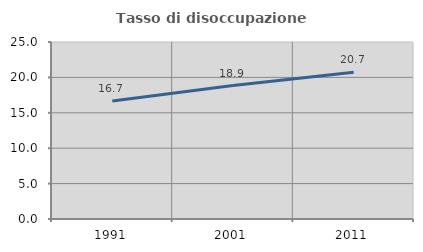
| Category | Tasso di disoccupazione giovanile  |
|---|---|
| 1991.0 | 16.667 |
| 2001.0 | 18.852 |
| 2011.0 | 20.732 |